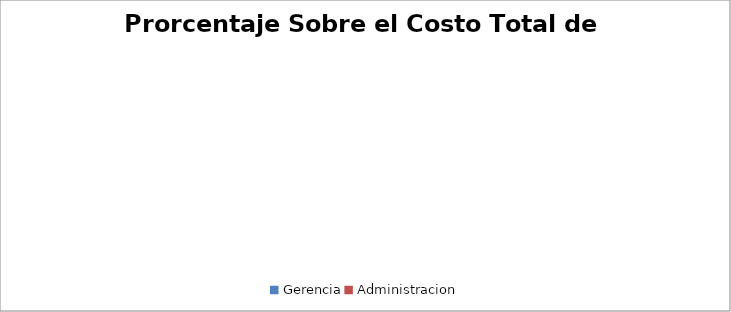
| Category | Prorcentaje Sobre el Costo Total de Materiales |
|---|---|
| Gerencia | 0 |
| Administracion | 0 |